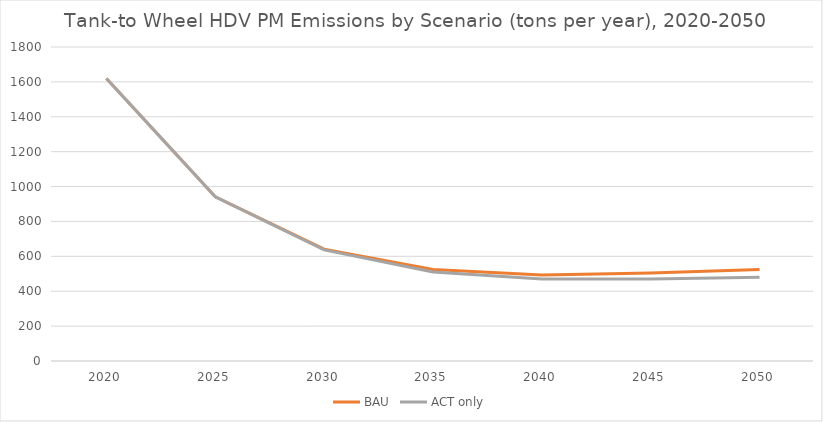
| Category | BAU | ACT only |
|---|---|---|
| 2020.0 | 1618.983 | 1618.983 |
| 2025.0 | 941.208 | 941.208 |
| 2030.0 | 640.921 | 636.742 |
| 2035.0 | 524.813 | 510.227 |
| 2040.0 | 493.043 | 469.522 |
| 2045.0 | 504.751 | 470.256 |
| 2050.0 | 524.312 | 480.184 |